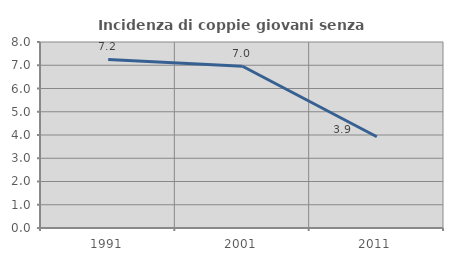
| Category | Incidenza di coppie giovani senza figli |
|---|---|
| 1991.0 | 7.249 |
| 2001.0 | 6.955 |
| 2011.0 | 3.924 |